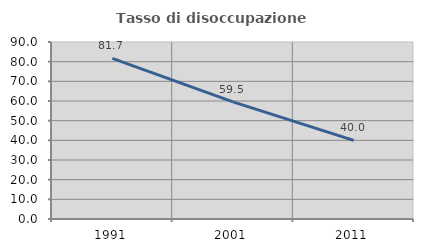
| Category | Tasso di disoccupazione giovanile  |
|---|---|
| 1991.0 | 81.672 |
| 2001.0 | 59.542 |
| 2011.0 | 40 |